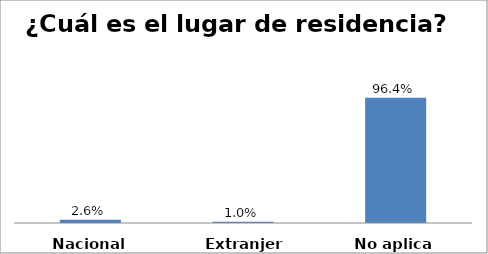
| Category | Series 0 |
|---|---|
| Nacional | 0.026 |
| Extranjero | 0.01 |
| No aplica | 0.964 |